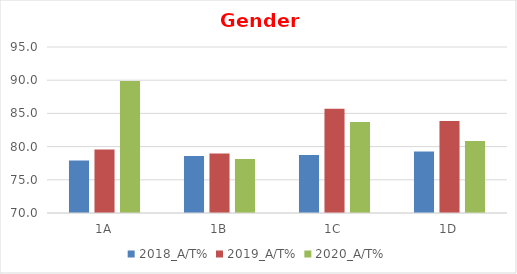
| Category | 2018_A/T% | 2019_A/T% | 2020_A/T% |
|---|---|---|---|
| 1A | 77.922 | 79.545 | 89.888 |
| 1B | 78.571 | 78.947 | 78.125 |
| 1C | 78.75 | 85.714 | 83.696 |
| 1D | 79.268 | 83.871 | 80.851 |